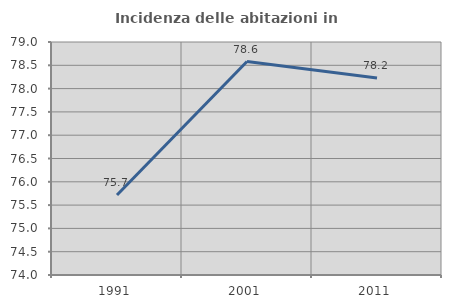
| Category | Incidenza delle abitazioni in proprietà  |
|---|---|
| 1991.0 | 75.717 |
| 2001.0 | 78.581 |
| 2011.0 | 78.225 |